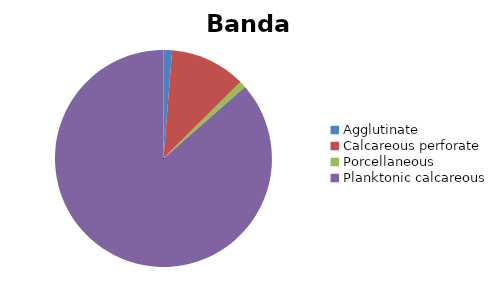
| Category | Banda mounds |
|---|---|
| ﻿Agglutinate | 1.268 |
| Calcareous perforate | 11.299 |
| Porcellaneous | 0.96 |
| Planktonic calcareous | 86.473 |